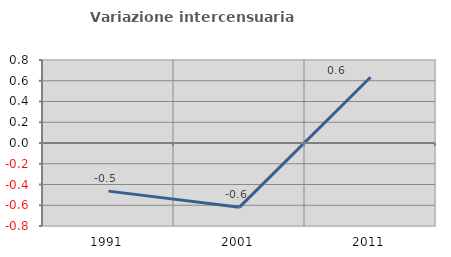
| Category | Variazione intercensuaria annua |
|---|---|
| 1991.0 | -0.464 |
| 2001.0 | -0.618 |
| 2011.0 | 0.634 |